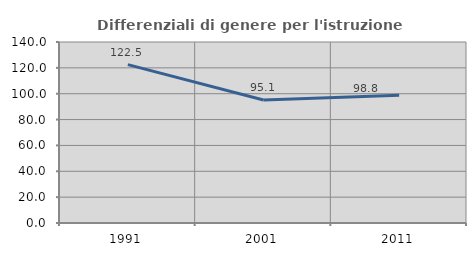
| Category | Differenziali di genere per l'istruzione superiore |
|---|---|
| 1991.0 | 122.537 |
| 2001.0 | 95.124 |
| 2011.0 | 98.836 |